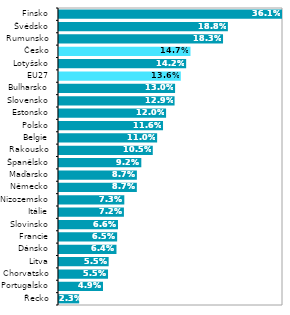
| Category | 2019* |
|---|---|
| Řecko | 0.023 |
| Portugalsko | 0.049 |
| Chorvatsko | 0.055 |
| Litva | 0.055 |
| Dánsko | 0.064 |
| Francie | 0.065 |
| Slovinsko | 0.066 |
| Itálie | 0.072 |
| Nizozemsko | 0.073 |
| Německo | 0.087 |
| Maďarsko | 0.087 |
| Španělsko | 0.092 |
| Rakousko | 0.105 |
| Belgie | 0.11 |
| Polsko | 0.116 |
| Estonsko | 0.12 |
| Slovensko | 0.129 |
| Bulharsko | 0.13 |
| EU27 | 0.136 |
| Lotyšsko | 0.142 |
| Česko | 0.147 |
| Rumunsko | 0.183 |
| Švédsko | 0.188 |
| Finsko | 0.361 |